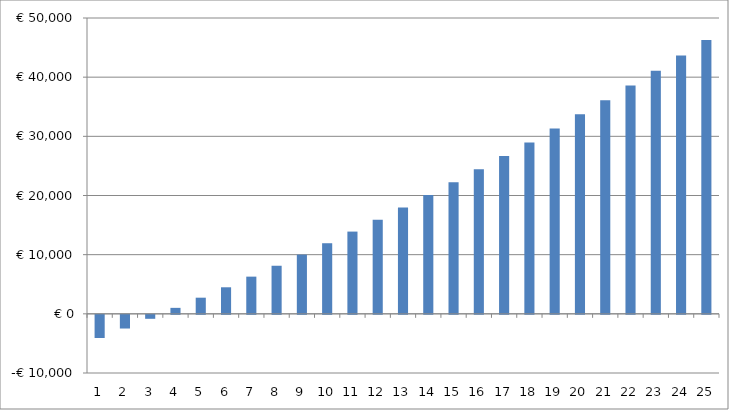
| Category | Series 0 |
|---|---|
| 0 | -3920 |
| 1 | -2314.171 |
| 2 | -671.226 |
| 3 | 1009.578 |
| 4 | 2728.999 |
| 5 | 4487.808 |
| 6 | 6286.793 |
| 7 | 8126.757 |
| 8 | 10008.521 |
| 9 | 11932.92 |
| 10 | 13900.808 |
| 11 | 15913.053 |
| 12 | 17970.542 |
| 13 | 20074.182 |
| 14 | 22224.894 |
| 15 | 24423.621 |
| 16 | 26671.322 |
| 17 | 28968.978 |
| 18 | 31317.586 |
| 19 | 33718.167 |
| 20 | 36119.313 |
| 21 | 38573.483 |
| 22 | 41081.737 |
| 23 | 43645.155 |
| 24 | 46264.842 |